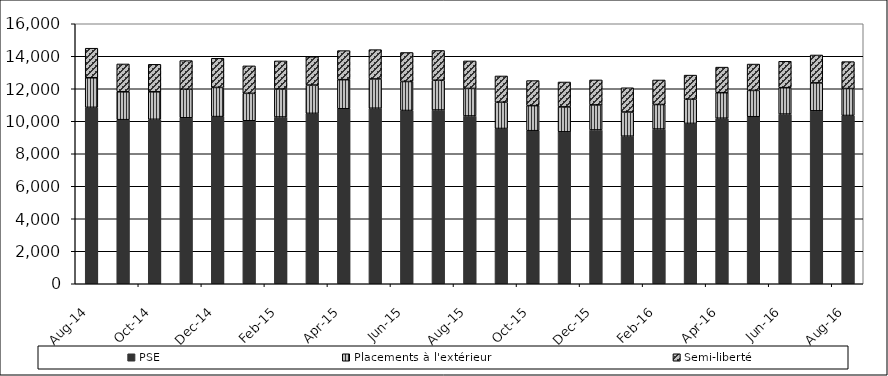
| Category | PSE | Placements à l'extérieur | Semi-liberté |
|---|---|---|---|
| 2014-08-01 | 10856 | 1820 | 1820 |
| 2014-09-01 | 10098 | 1714 | 1714 |
| 2014-10-01 | 10120 | 1692 | 1692 |
| 2014-11-01 | 10213 | 1760 | 1760 |
| 2014-12-01 | 10287 | 1794 | 1794 |
| 2015-01-01 | 10030 | 1689 | 1689 |
| 2015-02-01 | 10261 | 1726 | 1726 |
| 2015-03-01 | 10485 | 1742 | 1742 |
| 2015-04-01 | 10770 | 1789 | 1789 |
| 2015-05-01 | 10801 | 1803 | 1803 |
| 2015-06-01 | 10662 | 1785 | 1785 |
| 2015-07-01 | 10692 | 1832 | 1832 |
| 2015-08-01 | 10325 | 1694 | 1694 |
| 2015-09-01 | 9555 | 1616 | 1616 |
| 2015-10-01 | 9420 | 1542 | 1542 |
| 2015-11-01 | 9350 | 1533 | 1533 |
| 2015-12-01 | 9466 | 1539 | 1539 |
| 2016-01-01 | 9081 | 1490 | 1490 |
| 2016-02-01 | 9521 | 1510 | 1510 |
| 2016-03-01 | 9868 | 1486 | 1486 |
| 2016-04-01 | 10187 | 1572 | 1572 |
| 2016-05-01 | 10278 | 1621 | 1621 |
| 2016-06-01 | 10441 | 1625 | 1625 |
| 2016-07-01 | 10642 | 1718 | 1718 |
| 2016-08-01 | 10355 | 1658 | 1658 |